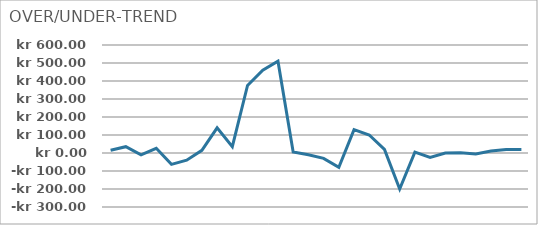
| Category | DIFFERANSE |
|---|---|
| 0 | 15 |
| 1 | 35 |
| 2 | -10 |
| 3 | 26 |
| 4 | -63 |
| 5 | -40 |
| 6 | 15 |
| 7 | 140 |
| 8 | 35 |
| 9 | 375 |
| 10 | 460 |
| 11 | 510 |
| 12 | 6 |
| 13 | -10 |
| 14 | -30 |
| 15 | -80 |
| 16 | 130 |
| 17 | 100 |
| 18 | 20 |
| 19 | -200 |
| 20 | 5 |
| 21 | -25 |
| 22 | 0 |
| 23 | 1 |
| 24 | -5 |
| 25 | 11 |
| 26 | 20 |
| 27 | 20 |